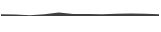
| Category | Series 0 |
|---|---|
| 0 | 0.107 |
| 1 | 0.093 |
| 2 | 0.054 |
| 3 | 0.107 |
| 4 | 0.213 |
| 5 | 0.13 |
| 6 | 0.132 |
| 7 | 0.108 |
| 8 | 0.133 |
| 9 | 0.152 |
| 10 | 0.147 |
| 11 | 0.111 |